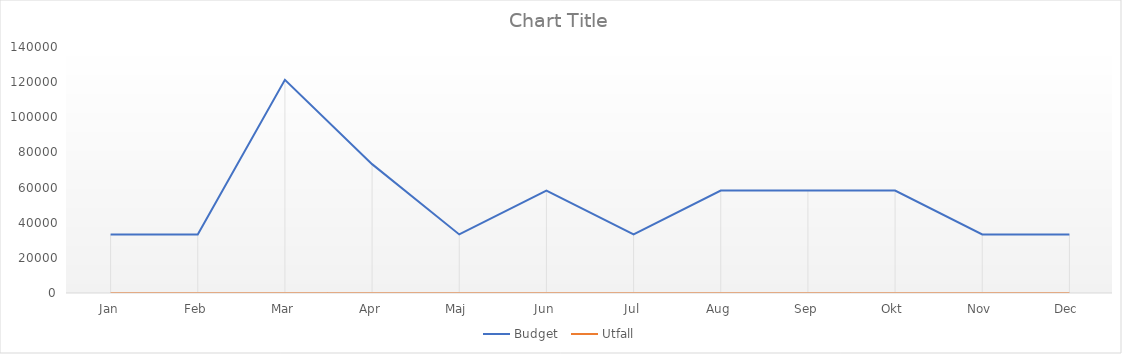
| Category | Budget  | Utfall |
|---|---|---|
| Jan | 33334 | 0 |
| Feb | 33334 | 0 |
| Mar | 121334 | 0 |
| Apr | 73334 | 0 |
| Maj | 33333 | 0 |
| Jun | 58333 | 0 |
| Jul | 33333 | 0 |
| Aug | 58333 | 0 |
| Sep | 58333 | 0 |
| Okt | 58333 | 0 |
| Nov | 33333 | 0 |
| Dec | 33333 | 0 |